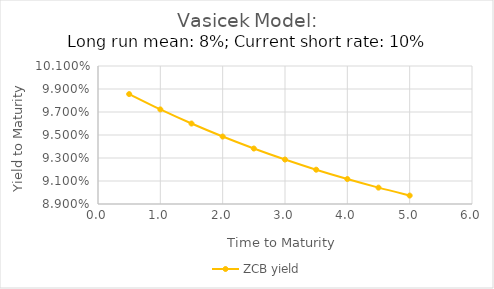
| Category | ZCB yield |
|---|---|
| 0.5 | 0.099 |
| 1.0 | 0.097 |
| 1.5 | 0.096 |
| 2.0 | 0.095 |
| 2.5 | 0.094 |
| 3.0 | 0.093 |
| 3.5 | 0.092 |
| 4.0 | 0.091 |
| 4.5 | 0.09 |
| 5.0 | 0.09 |